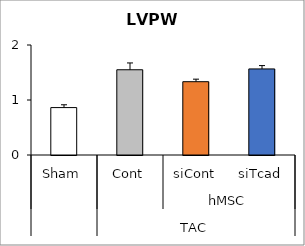
| Category | Series 0 |
|---|---|
| 0 | 0.862 |
| 1 | 1.55 |
| 2 | 1.333 |
| 3 | 1.565 |